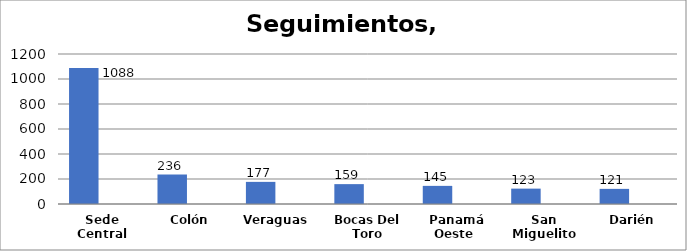
| Category | Series 0 | Series 1 |
|---|---|---|
| Sede Central | 1088 |  |
| Colón | 236 |  |
| Veraguas  | 177 |  |
| Bocas Del Toro | 159 |  |
| Panamá Oeste  | 145 |  |
| San Miguelito | 123 |  |
| Darién | 121 |  |